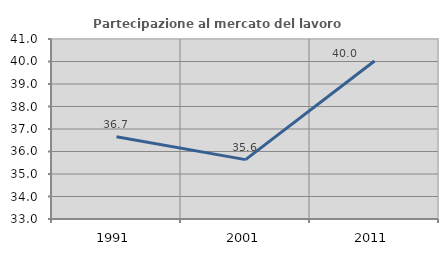
| Category | Partecipazione al mercato del lavoro  femminile |
|---|---|
| 1991.0 | 36.652 |
| 2001.0 | 35.64 |
| 2011.0 | 40.024 |